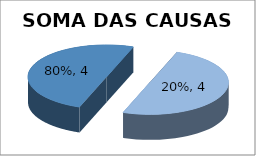
| Category | Series 0 |
|---|---|
| 0.8 | 4 |
| 0.19999999999999996 | 4 |